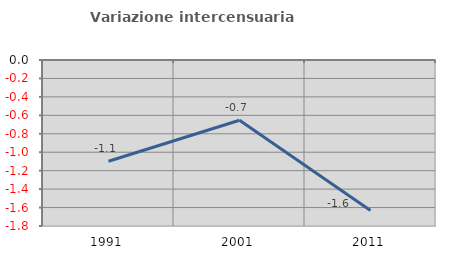
| Category | Variazione intercensuaria annua |
|---|---|
| 1991.0 | -1.098 |
| 2001.0 | -0.653 |
| 2011.0 | -1.632 |